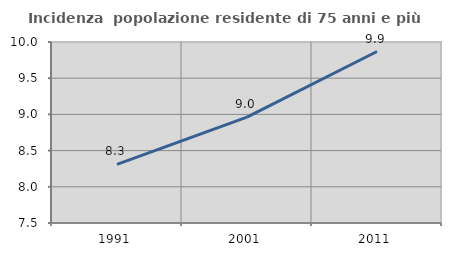
| Category | Incidenza  popolazione residente di 75 anni e più |
|---|---|
| 1991.0 | 8.311 |
| 2001.0 | 8.963 |
| 2011.0 | 9.869 |